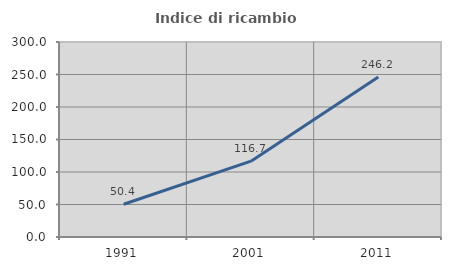
| Category | Indice di ricambio occupazionale  |
|---|---|
| 1991.0 | 50.376 |
| 2001.0 | 116.667 |
| 2011.0 | 246.154 |